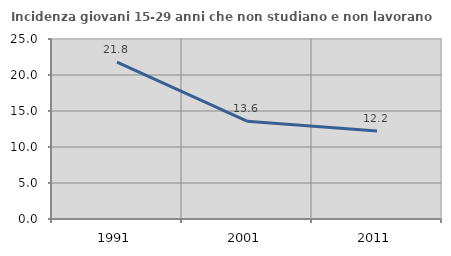
| Category | Incidenza giovani 15-29 anni che non studiano e non lavorano  |
|---|---|
| 1991.0 | 21.785 |
| 2001.0 | 13.585 |
| 2011.0 | 12.236 |